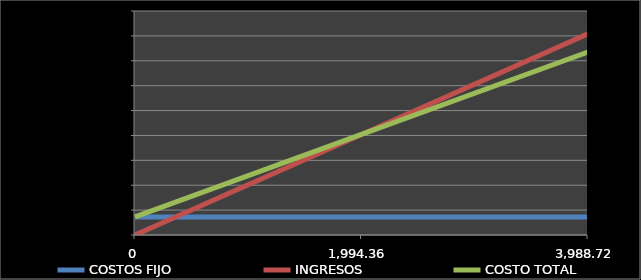
| Category | COSTOS FIJO | INGRESOS | COSTO TOTAL |
|---|---|---|---|
| 0.0 | 727424000 | 0 | 727424000 |
| 1994.3611929380995 | 727424000 | 4041244444.444 | 4041244444.444 |
| 3988.722385876199 | 727424000 | 8082488888.889 | 7355064888.889 |